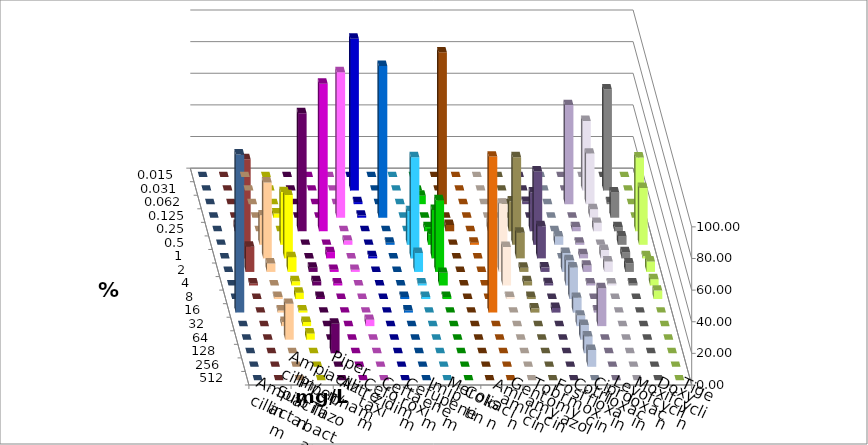
| Category | Ampicillin | Ampicillin/ Sulbactam | Piperacillin | Piperacillin/ Tazobactam | Aztreonam | Cefotaxim | Ceftazidim | Cefuroxim | Imipenem | Meropenem | Colistin | Amikacin | Gentamicin | Tobramycin | Fosfomycin | Cotrimoxazol | Ciprofloxacin | Levofloxacin | Moxifloxacin | Doxycyclin | Tigecyclin |
|---|---|---|---|---|---|---|---|---|---|---|---|---|---|---|---|---|---|---|---|---|---|
| 0.015 | 0 | 0 | 0 | 0 | 0 | 0 | 0 | 0 | 0 | 0 | 0 | 0 | 0 | 0 | 0 | 0 | 0 | 0 | 0 | 0 | 0 |
| 0.031 | 0 | 0 | 0 | 0 | 0 | 96 | 0 | 0 | 0 | 0 | 0 | 0 | 0 | 0 | 0 | 0 | 44 | 64 | 0 | 0 | 0 |
| 0.062 | 0 | 0 | 0 | 0 | 0 | 1.333 | 0 | 0 | 5.333 | 96 | 0 | 0 | 0 | 1.449 | 0 | 62.667 | 32 | 1.333 | 0 | 0 | 0 |
| 0.125 | 0 | 2.667 | 0 | 0 | 92 | 1.333 | 96 | 0 | 0 | 0 | 0 | 0 | 0 | 0 | 0 | 0 | 5.333 | 16 | 0 | 0 | 0 |
| 0.25 | 0 | 0 | 74.667 | 93.333 | 0 | 0 | 0 | 0 | 2.667 | 4 | 0 | 5.405 | 18.919 | 24.638 | 0 | 2.667 | 5.333 | 2.667 | 46.667 | 0 | 4 |
| 0.5 | 18.667 | 33.333 | 0 | 0 | 2.667 | 0 | 1.333 | 21.333 | 6.667 | 0 | 1.351 | 0 | 55.405 | 46.377 | 5.333 | 1.333 | 0 | 5.333 | 36 | 0 | 16 |
| 1.0 | 48 | 40 | 0 | 4 | 0 | 1.333 | 0 | 64 | 30.667 | 0 | 0 | 25.676 | 16.216 | 20.29 | 0 | 2.667 | 5.333 | 4 | 1.333 | 0 | 62.667 |
| 2.0 | 5.333 | 9.333 | 2.667 | 1.333 | 1.333 | 0 | 0 | 12 | 45.333 | 0 | 0 | 43.243 | 2.703 | 2.899 | 12 | 4 | 6.667 | 5.333 | 6.667 | 0 | 16 |
| 4.0 | 0 | 2.667 | 2.667 | 1.333 | 0 | 0 | 0 | 1.333 | 8 | 0 | 0 | 24.324 | 2.703 | 1.449 | 16 | 1.333 | 1.333 | 1.333 | 4 | 0 | 1.333 |
| 8.0 | 1.333 | 4 | 1.333 | 0 | 0 | 0 | 1.333 | 1.333 | 1.333 | 0 | 0 | 1.351 | 1.351 | 0 | 20 | 0 | 0 | 0 | 5.333 | 0 | 0 |
| 16.0 | 1.333 | 1.333 | 0 | 0 | 0 | 0 | 1.333 | 0 | 0 | 0 | 98.649 | 0 | 2.703 | 2.899 | 9.333 | 1.333 | 0 | 0 | 0 | 100 | 0 |
| 32.0 | 2.667 | 2.667 | 0 | 0 | 4 | 0 | 0 | 0 | 0 | 0 | 0 | 0 | 0 | 0 | 6.667 | 24 | 0 | 0 | 0 | 0 | 0 |
| 64.0 | 22.667 | 4 | 0 | 0 | 0 | 0 | 0 | 0 | 0 | 0 | 0 | 0 | 0 | 0 | 9.333 | 0 | 0 | 0 | 0 | 0 | 0 |
| 128.0 | 0 | 0 | 18.667 | 0 | 0 | 0 | 0 | 0 | 0 | 0 | 0 | 0 | 0 | 0 | 10.667 | 0 | 0 | 0 | 0 | 0 | 0 |
| 256.0 | 0 | 0 | 0 | 0 | 0 | 0 | 0 | 0 | 0 | 0 | 0 | 0 | 0 | 0 | 10.667 | 0 | 0 | 0 | 0 | 0 | 0 |
| 512.0 | 0 | 0 | 0 | 0 | 0 | 0 | 0 | 0 | 0 | 0 | 0 | 0 | 0 | 0 | 0 | 0 | 0 | 0 | 0 | 0 | 0 |